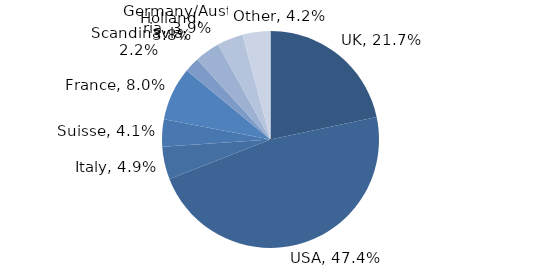
| Category | Investment Style |
|---|---|
| UK | 0.217 |
| USA | 0.474 |
| Italy | 0.049 |
| Suisse | 0.041 |
| France | 0.08 |
| Scandinavia | 0.022 |
| Holland | 0.038 |
| Germany/Austria | 0.039 |
| Other | 0.042 |